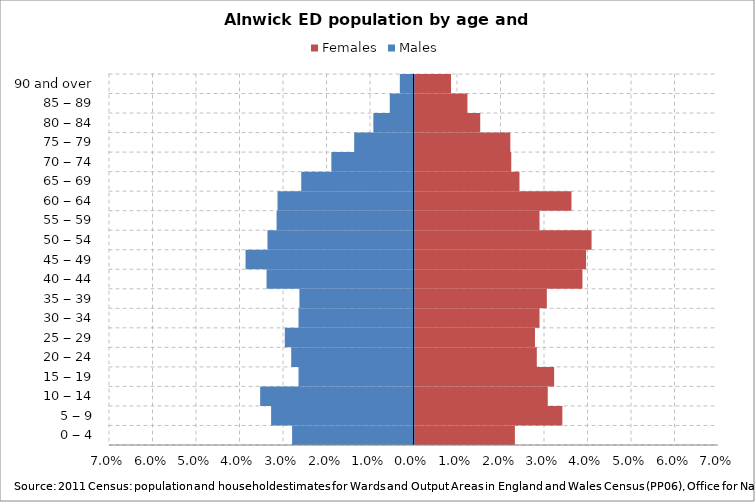
| Category | Females | Males |
|---|---|---|
| 0 ‒ 4 | 0.023 | -0.028 |
| 5 ‒ 9 | 0.034 | -0.033 |
| 10 ‒ 14 | 0.031 | -0.035 |
| 15 ‒ 19 | 0.032 | -0.026 |
| 20 ‒ 24 | 0.028 | -0.028 |
| 25 ‒ 29 | 0.028 | -0.03 |
| 30 ‒ 34 | 0.029 | -0.026 |
| 35 ‒ 39 | 0.03 | -0.026 |
| 40 ‒ 44 | 0.039 | -0.034 |
| 45 ‒ 49 | 0.039 | -0.039 |
| 50 ‒ 54 | 0.041 | -0.034 |
| 55 ‒ 59 | 0.029 | -0.031 |
| 60 ‒ 64 | 0.036 | -0.031 |
| 65 ‒ 69 | 0.024 | -0.026 |
| 70 ‒ 74 | 0.022 | -0.019 |
| 75 ‒ 79 | 0.022 | -0.014 |
| 80 ‒ 84 | 0.015 | -0.009 |
| 85 ‒ 89 | 0.012 | -0.005 |
| 90 and over | 0.008 | -0.003 |